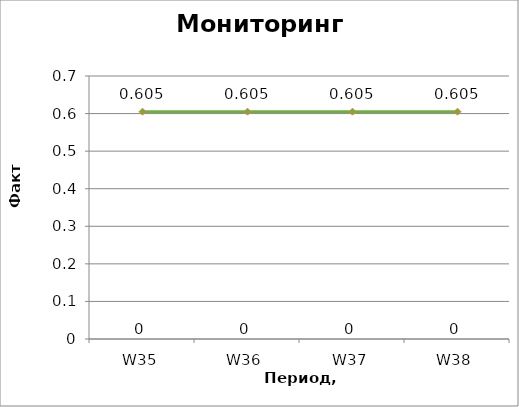
| Category | Факт ОЕЕ |
|---|---|
| W35 | 0 |
| W36 | 0 |
| W37 | 0 |
| W38 | 0 |